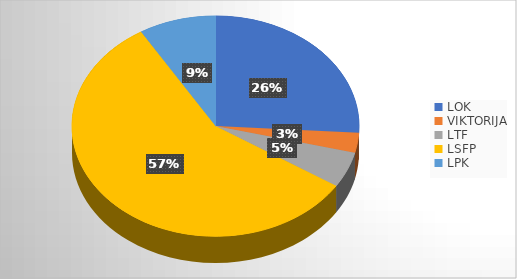
| Category | Series 0 |
|---|---|
| LOK | 12000 |
| VIKTORIJA | 1344 |
| LTF | 2422.55 |
| LSFP | 26434 |
| LPK | 4000 |